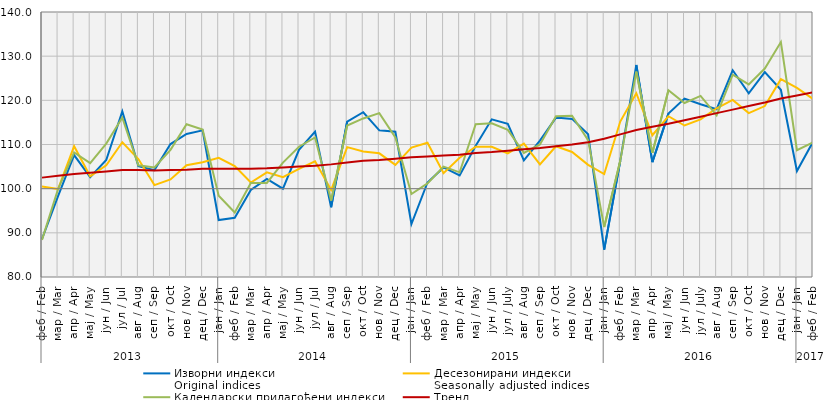
| Category | Изворни индекси
Original indices | Десезонирани индекси
Seasonally adjusted indices | Календарски прилагођени индекси
Working-day adjusted indices | Тренд
Trend |
|---|---|---|---|---|
| 0 | 88.6 | 100.5 | 88.4 | 102.5 |
| 1 | 98.3 | 99.9 | 99.9 | 102.9 |
| 2 | 107.6 | 109.6 | 108.2 | 103.3 |
| 3 | 102.6 | 102.8 | 105.8 | 103.6 |
| 4 | 106.5 | 105.3 | 110.2 | 103.9 |
| 5 | 117.5 | 110.5 | 116.1 | 104.2 |
| 6 | 105.1 | 106.7 | 105.3 | 104.2 |
| 7 | 104.2 | 100.8 | 104.8 | 104.1 |
| 8 | 110.1 | 102.1 | 108.8 | 104.2 |
| 9 | 112.4 | 105.3 | 114.6 | 104.3 |
| 10 | 113.2 | 106 | 113.4 | 104.5 |
| 11 | 92.9 | 107 | 98.4 | 104.5 |
| 12 | 93.4 | 105.1 | 94.6 | 104.5 |
| 13 | 99.7 | 101.4 | 101.3 | 104.5 |
| 14 | 102.2 | 103.7 | 101.3 | 104.6 |
| 15 | 100 | 102.6 | 105.9 | 104.8 |
| 16 | 108.8 | 104.5 | 109.5 | 105 |
| 17 | 112.9 | 106.2 | 111.6 | 105.2 |
| 18 | 95.8 | 99.7 | 97.3 | 105.5 |
| 19 | 115.2 | 109.4 | 114.3 | 105.9 |
| 20 | 117.3 | 108.4 | 115.9 | 106.3 |
| 21 | 113.2 | 108 | 117.1 | 106.5 |
| 22 | 112.9 | 105.4 | 111.6 | 106.8 |
| 23 | 92 | 109.3 | 98.8 | 107.1 |
| 24 | 101.4 | 110.4 | 101.2 | 107.3 |
| 25 | 104.8 | 103.5 | 105 | 107.5 |
| 26 | 103 | 107 | 103.7 | 107.7 |
| 27 | 109.7 | 109.5 | 114.6 | 108.1 |
| 28 | 115.7 | 109.5 | 114.8 | 108.3 |
| 29 | 114.7 | 108 | 113.3 | 108.6 |
| 30 | 106.4 | 110.2 | 108.1 | 108.9 |
| 31 | 110.9 | 105.5 | 110 | 109.2 |
| 32 | 116.1 | 109.6 | 116.4 | 109.6 |
| 33 | 115.8 | 108.3 | 116.5 | 110 |
| 34 | 112.3 | 105.4 | 111 | 110.5 |
| 35 | 86.2 | 103.3 | 91.3 | 111.3 |
| 36 | 106.3 | 115.2 | 106.3 | 112.3 |
| 37 | 128 | 121.6 | 126.5 | 113.3 |
| 38 | 106 | 112.1 | 108.1 | 114 |
| 39 | 117 | 116.4 | 122.3 | 114.7 |
| 40 | 120.4 | 114.3 | 119.4 | 115.5 |
| 41 | 119.1 | 115.7 | 121 | 116.3 |
| 42 | 118 | 118.2 | 116.6 | 117.1 |
| 43 | 126.8 | 120.1 | 125.8 | 117.9 |
| 44 | 121.6 | 117.1 | 123.6 | 118.7 |
| 45 | 126.4 | 118.7 | 127.2 | 119.5 |
| 46 | 122.4 | 124.8 | 133.2 | 120.4 |
| 47 | 104 | 122.8 | 108.7 | 121.1 |
| 48 | 110.6 | 120.3 | 110.5 | 121.8 |